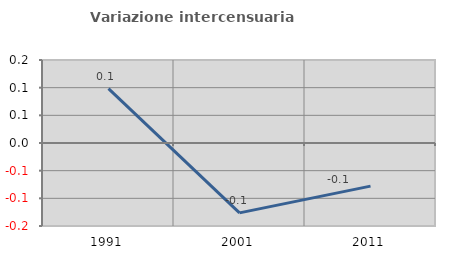
| Category | Variazione intercensuaria annua |
|---|---|
| 1991.0 | 0.098 |
| 2001.0 | -0.126 |
| 2011.0 | -0.078 |